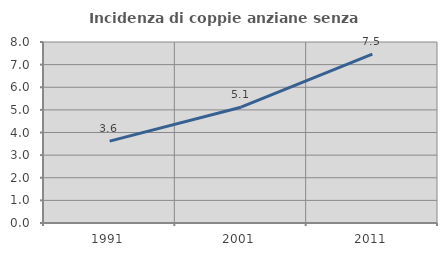
| Category | Incidenza di coppie anziane senza figli  |
|---|---|
| 1991.0 | 3.617 |
| 2001.0 | 5.118 |
| 2011.0 | 7.466 |